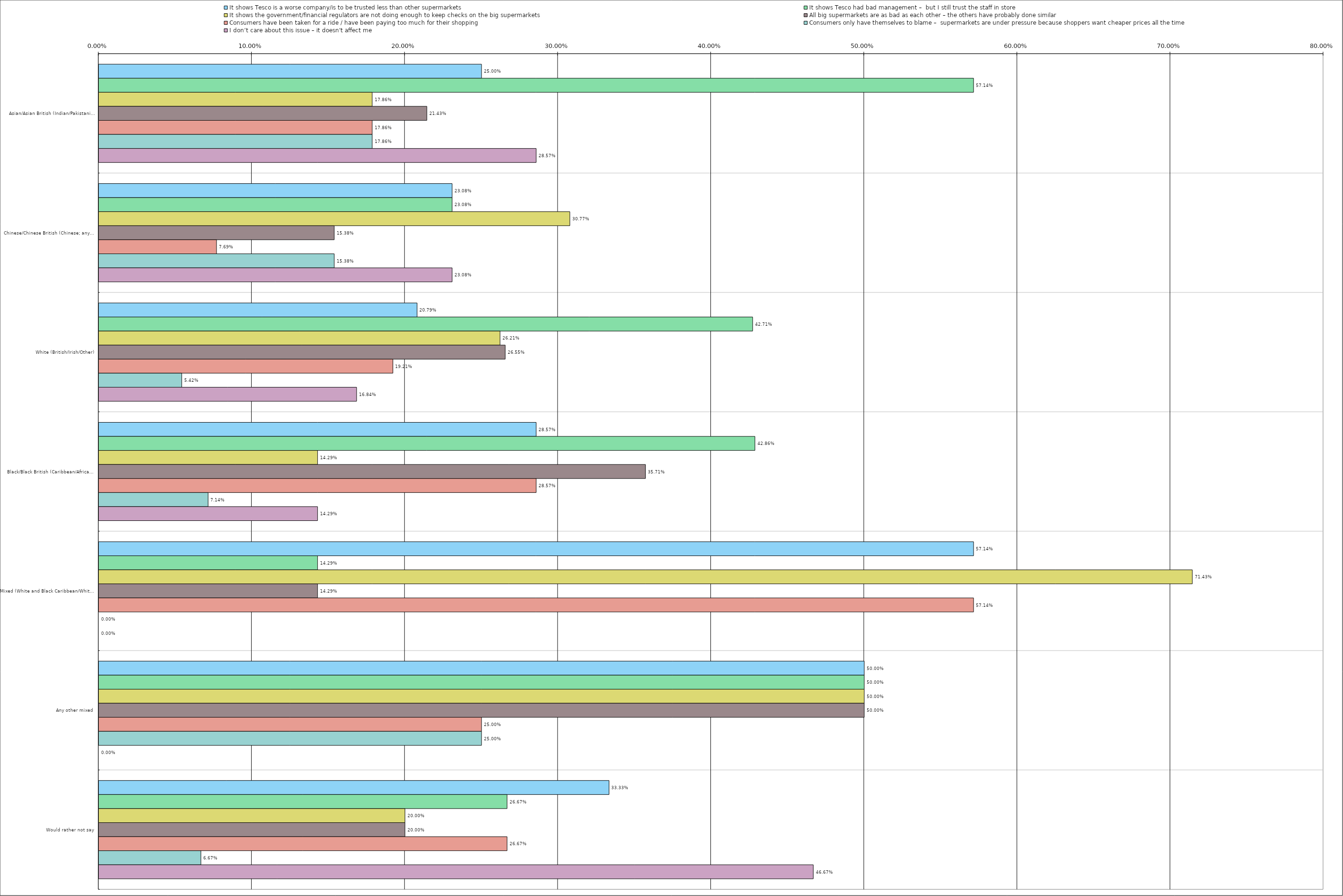
| Category | It shows Tesco is a worse company/is to be trusted less than other supermarkets | It shows Tesco had bad management –  but I still trust the staff in store | It shows the government/financial regulators are not doing enough to keep checks on the big supermarkets | All big supermarkets are as bad as each other – the others have probably done similar | Consumers have been taken for a ride / have been paying too much for their shopping | Consumers only have themselves to blame –  supermarkets are under pressure because shoppers want cheaper prices all the time | I don’t care about this issue – it doesn't affect me |
|---|---|---|---|---|---|---|---|
| 0 | 0.25 | 0.571 | 0.179 | 0.214 | 0.179 | 0.179 | 0.286 |
| 1 | 0.231 | 0.231 | 0.308 | 0.154 | 0.077 | 0.154 | 0.231 |
| 2 | 0.208 | 0.427 | 0.262 | 0.266 | 0.192 | 0.054 | 0.168 |
| 3 | 0.286 | 0.429 | 0.143 | 0.357 | 0.286 | 0.071 | 0.143 |
| 4 | 0.571 | 0.143 | 0.714 | 0.143 | 0.571 | 0 | 0 |
| 5 | 0.5 | 0.5 | 0.5 | 0.5 | 0.25 | 0.25 | 0 |
| 6 | 0.333 | 0.267 | 0.2 | 0.2 | 0.267 | 0.067 | 0.467 |